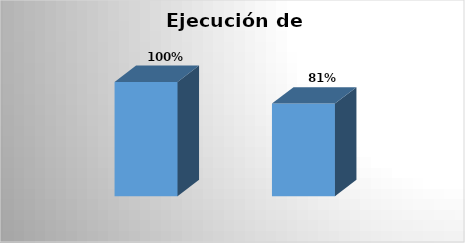
| Category | Series 0 |
|---|---|
| Año 2022 | 1 |
| 2do Trimestre | 0.81 |